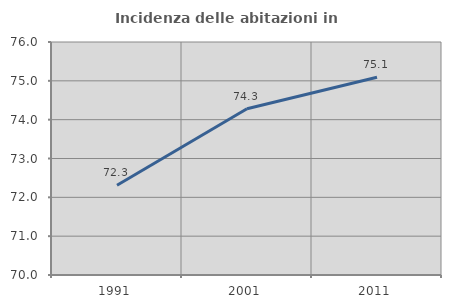
| Category | Incidenza delle abitazioni in proprietà  |
|---|---|
| 1991.0 | 72.31 |
| 2001.0 | 74.28 |
| 2011.0 | 75.092 |